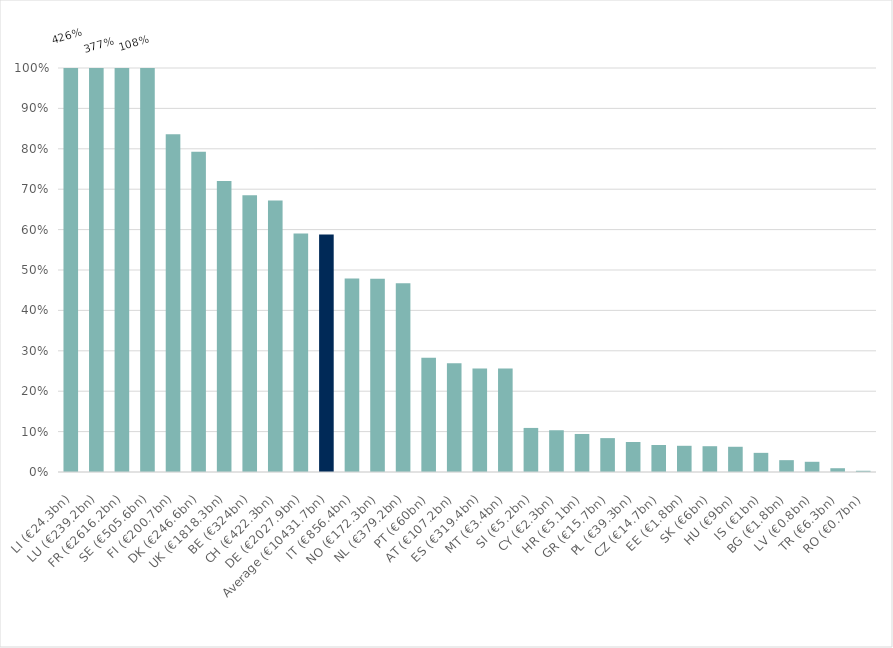
| Category | 2019 |
|---|---|
| LI (€24.3bn) | 4.245 |
| LU (€239.2bn) | 3.766 |
| FR (€2616.2bn) | 1.082 |
| SE (€505.6bn) | 1.066 |
| FI (€200.7bn) | 0.836 |
| DK (€246.6bn) | 0.793 |
| UK (€1818.3bn) | 0.721 |
| BE (€324bn) | 0.685 |
| CH (€422.3bn) | 0.672 |
| DE (€2027.9bn) | 0.59 |
| Average (€10431.7bn) | 0.588 |
| IT (€856.4bn) | 0.479 |
| NO (€172.3bn) | 0.478 |
| NL (€379.2bn) | 0.467 |
| PT (€60bn) | 0.283 |
| AT (€107.2bn) | 0.269 |
| ES (€319.4bn) | 0.256 |
| MT (€3.4bn) | 0.256 |
| SI (€5.2bn) | 0.109 |
| CY (€2.3bn) | 0.103 |
| HR (€5.1bn) | 0.094 |
| GR (€15.7bn) | 0.084 |
| PL (€39.3bn) | 0.074 |
| CZ (€14.7bn) | 0.067 |
| EE (€1.8bn) | 0.065 |
| SK (€6bn) | 0.064 |
| HU (€9bn) | 0.062 |
| IS (€1bn) | 0.047 |
| BG (€1.8bn) | 0.029 |
| LV (€0.8bn) | 0.025 |
| TR (€6.3bn) | 0.009 |
| RO (€0.7bn) | 0.003 |